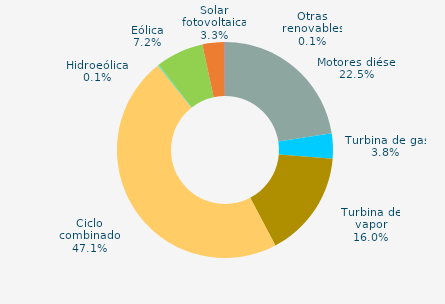
| Category | Series 0 |
|---|---|
| Motores diésel | 22.511 |
| Turbina de gas | 3.784 |
| Turbina de vapor | 15.976 |
| Ciclo combinado | 47.054 |
| Cogeneración | 0 |
| Hidráulica | 0.04 |
| Hidroeólica | 0.09 |
| Eólica | 7.18 |
| Solar fotovoltaica | 3.298 |
| Otras renovables | 0.068 |